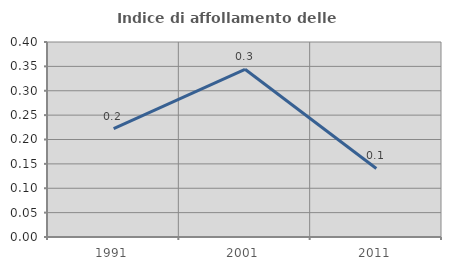
| Category | Indice di affollamento delle abitazioni  |
|---|---|
| 1991.0 | 0.222 |
| 2001.0 | 0.344 |
| 2011.0 | 0.141 |